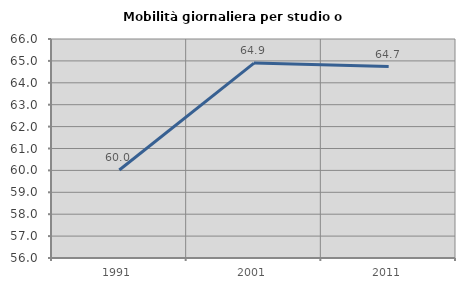
| Category | Mobilità giornaliera per studio o lavoro |
|---|---|
| 1991.0 | 60.018 |
| 2001.0 | 64.899 |
| 2011.0 | 64.742 |